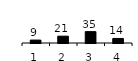
| Category | Series 0 |
|---|---|
| 1.0 | 9 |
| 2.0 | 21 |
| 3.0 | 35 |
| 4.0 | 14 |